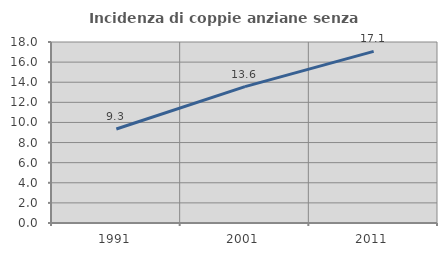
| Category | Incidenza di coppie anziane senza figli  |
|---|---|
| 1991.0 | 9.348 |
| 2001.0 | 13.565 |
| 2011.0 | 17.063 |